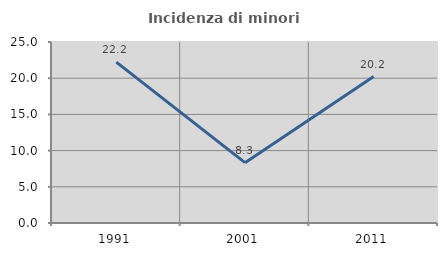
| Category | Incidenza di minori stranieri |
|---|---|
| 1991.0 | 22.222 |
| 2001.0 | 8.333 |
| 2011.0 | 20.225 |